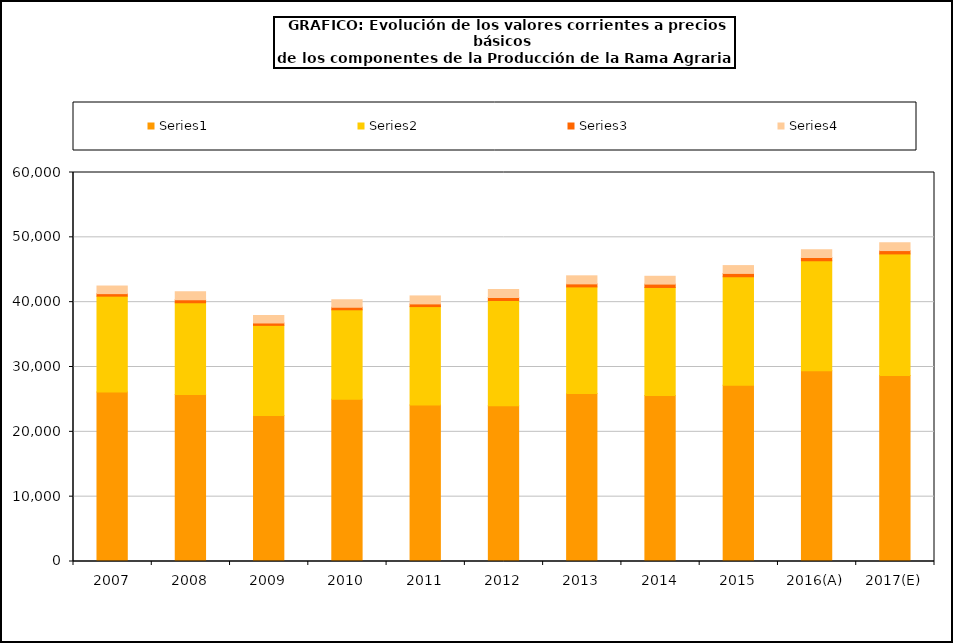
| Category | Series 1 | Series 2 | Series 3 | Series 4 |
|---|---|---|---|---|
| 2007 | 26148.4 | 14777 | 390.7 | 1173.6 |
| 2008 | 25756.5 | 14161.6 | 439 | 1232.2 |
| 2009 | 22510 | 13911.4 | 367.9 | 1156.5 |
| 2010 | 25028.1 | 13797.4 | 389.6 | 1156.1 |
| 2011 | 24157.4 | 15160 | 415.1 | 1231.2 |
| 2012 | 24030.3 | 16245.1 | 442.5 | 1236.6 |
| 2013 | 25895.9 | 16457.7 | 468.7 | 1242.3 |
| 2014 | 25585 | 16681.5 | 520.2 | 1207.1 |
| 2015 | 27192.2 | 16727.3 | 514.9 | 1207.6 |
| 2016(A) | 29438.7 | 16951 | 513.1 | 1188.2 |
| 2017(E) | 28687.4 | 18755.7 | 514.8 | 1207.6 |